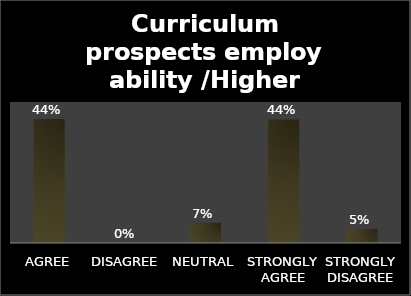
| Category | Series 0 |
|---|---|
| AGREE | 0.44 |
| DISAGREE | 0 |
| NEUTRAL | 0.072 |
| STRONGLY AGREE | 0.438 |
| STRONGLY DISAGREE | 0.05 |